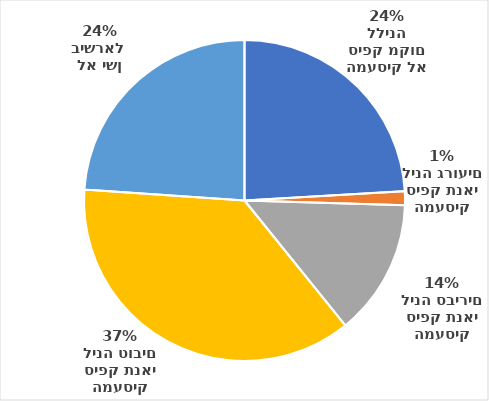
| Category | תנאים לשינה |
|---|---|
| המעסיק לא סיפק מקום ללינה | 156 |
| המעסיק סיפק תנאי לינה גרועים | 9 |
| המעסיק סיפק תנאי לינה סבירים | 89 |
| המעסיק סיפק תנאי לינה טובים | 239 |
| לא ישן בישראל  | 155 |